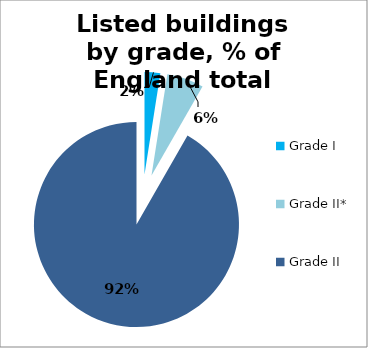
| Category | England % of total  by grade |
|---|---|
| Grade I | 0.025 |
| Grade II* | 0.058 |
| Grade II | 0.917 |